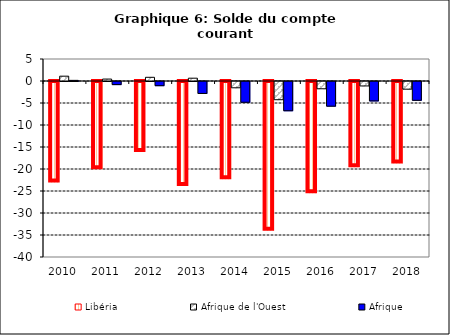
| Category | Libéria | Afrique de l'Ouest | Afrique |
|---|---|---|---|
| 2010.0 | -22.847 | 1.095 | 0.144 |
| 2011.0 | -19.845 | 0.439 | -0.706 |
| 2012.0 | -15.886 | 0.839 | -0.95 |
| 2013.0 | -23.63 | 0.638 | -2.715 |
| 2014.0 | -22.122 | -1.429 | -4.722 |
| 2015.0 | -33.787 | -4.138 | -6.65 |
| 2016.0 | -25.273 | -1.65 | -5.608 |
| 2017.0 | -19.369 | -1.011 | -4.418 |
| 2018.0 | -18.531 | -1.744 | -4.278 |